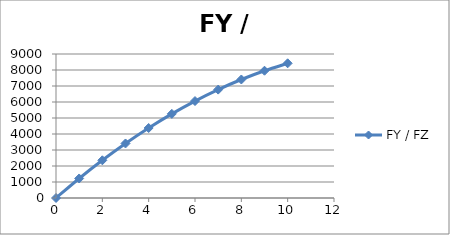
| Category | FY / FZ |
|---|---|
| 0.0 | 0 |
| 1.0 | 1219.98 |
| 2.0 | 2355.92 |
| 3.0 | 3407.82 |
| 4.0 | 4375.68 |
| 5.0 | 5259.5 |
| 6.0 | 6059.28 |
| 7.0 | 6775.02 |
| 8.0 | 7406.72 |
| 9.0 | 7954.38 |
| 10.0 | 8418 |